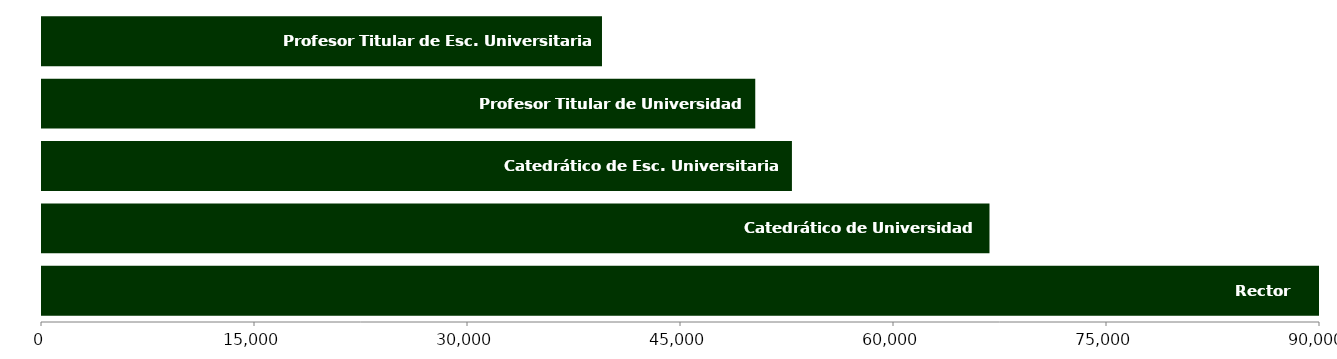
| Category | Series 3 |
|---|---|
| Rector | 91286.53 |
| Catedrático de Universidad | 66724.296 |
| Catedrático de Esc. Universitaria | 52811.28 |
| Profesor Titular de Universidad | 50229.202 |
| Profesor Titular de Esc. Universitaria | 39435.495 |